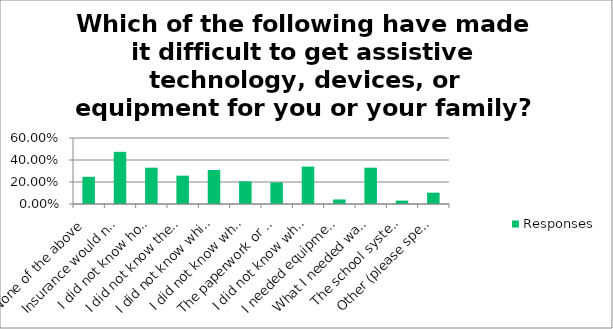
| Category | Responses |
|---|---|
| None of the above | 0.247 |
| Insurance would not pay for what was needed | 0.474 |
| I did not know how to get help in finding what I needed | 0.33 |
| I did not know there were devices, equipment, and/or assistive technology that could help me | 0.258 |
| I did not know which items would meet my needs | 0.309 |
| I did not know where I would purchase these items | 0.206 |
| The paperwork or programs to get these items were too overwhelming or confusing | 0.196 |
| I did not know where to go to try different types of devices, equipment, or assistive technology to see what would work for me | 0.34 |
| I needed equipment, devices, or assistive technology to do my job, but my employer would not pay for it | 0.041 |
| What I needed was too expensive | 0.33 |
| The school system's Special Education Program would not provide what was identified in the Individual Education Plan (IEP) | 0.031 |
| Other (please specify) | 0.103 |